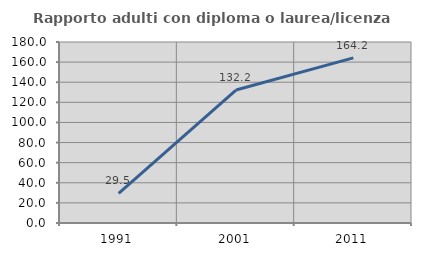
| Category | Rapporto adulti con diploma o laurea/licenza media  |
|---|---|
| 1991.0 | 29.496 |
| 2001.0 | 132.237 |
| 2011.0 | 164.205 |